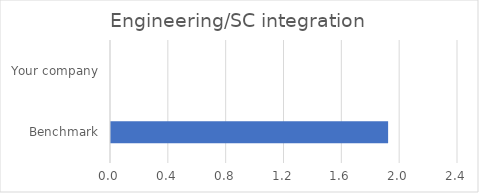
| Category | Engineering/SC integration |
|---|---|
| Benchmark | 1.917 |
| Your company | 0 |